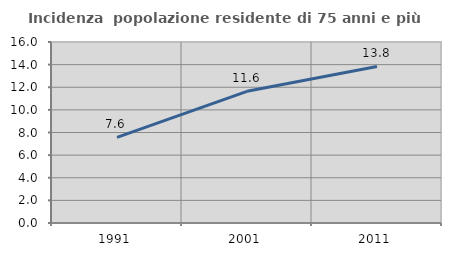
| Category | Incidenza  popolazione residente di 75 anni e più |
|---|---|
| 1991.0 | 7.575 |
| 2001.0 | 11.643 |
| 2011.0 | 13.837 |